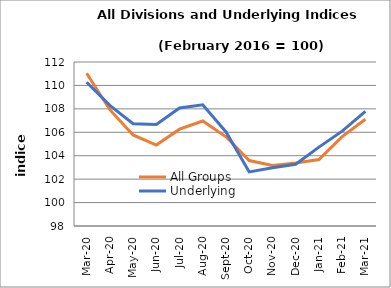
| Category | All Groups | Underlying |
|---|---|---|
| 2020-03-01 | 111.043 | 110.276 |
| 2020-04-01 | 107.93 | 108.297 |
| 2020-05-01 | 105.77 | 106.735 |
| 2020-06-01 | 104.913 | 106.661 |
| 2020-07-01 | 106.265 | 108.077 |
| 2020-08-01 | 106.963 | 108.349 |
| 2020-09-01 | 105.614 | 106.027 |
| 2020-10-01 | 103.588 | 102.619 |
| 2020-11-01 | 103.171 | 102.969 |
| 2020-12-01 | 103.378 | 103.266 |
| 2021-01-01 | 103.671 | 104.733 |
| 2021-02-01 | 105.627 | 106.099 |
| 2021-03-01 | 107.11 | 107.788 |